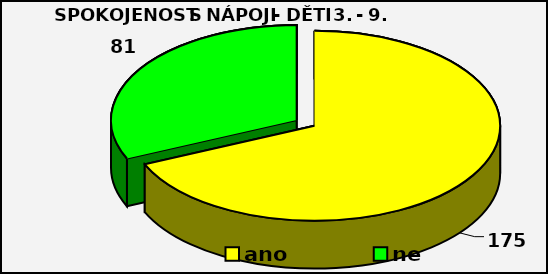
| Category | Series 0 |
|---|---|
| ano | 175 |
| ne | 81 |